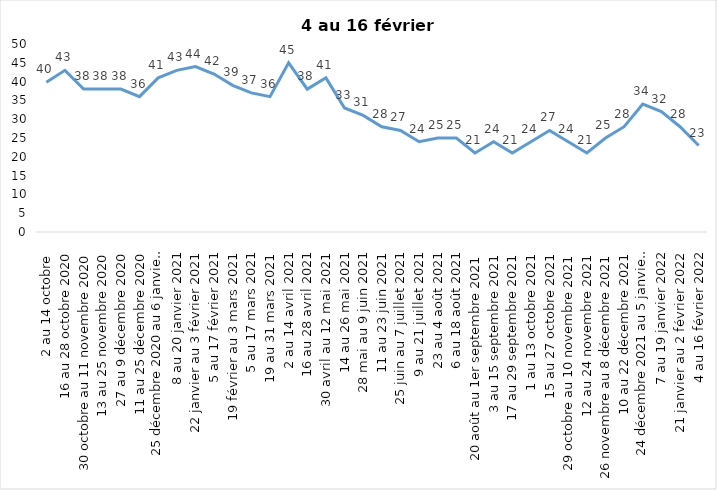
| Category | Toujours aux trois mesures |
|---|---|
| 2 au 14 octobre  | 39.85 |
| 16 au 28 octobre 2020 | 43 |
| 30 octobre au 11 novembre 2020 | 38 |
| 13 au 25 novembre 2020 | 38 |
| 27 au 9 décembre 2020 | 38 |
| 11 au 25 décembre 2020 | 36 |
| 25 décembre 2020 au 6 janvier 2021 | 41 |
| 8 au 20 janvier 2021 | 43 |
| 22 janvier au 3 février 2021 | 44 |
| 5 au 17 février 2021 | 42 |
| 19 février au 3 mars 2021 | 39 |
| 5 au 17 mars 2021 | 37 |
| 19 au 31 mars 2021 | 36 |
| 2 au 14 avril 2021 | 45 |
| 16 au 28 avril 2021 | 38 |
| 30 avril au 12 mai 2021 | 41 |
| 14 au 26 mai 2021 | 33 |
| 28 mai au 9 juin 2021 | 31 |
| 11 au 23 juin 2021 | 28 |
| 25 juin au 7 juillet 2021 | 27 |
| 9 au 21 juillet 2021 | 24 |
| 23 au 4 août 2021 | 25 |
| 6 au 18 août 2021 | 25 |
| 20 août au 1er septembre 2021 | 21 |
| 3 au 15 septembre 2021 | 24 |
| 17 au 29 septembre 2021 | 21 |
| 1 au 13 octobre 2021 | 24 |
| 15 au 27 octobre 2021 | 27 |
| 29 octobre au 10 novembre 2021 | 24 |
| 12 au 24 novembre 2021 | 21 |
| 26 novembre au 8 décembre 2021 | 25 |
| 10 au 22 décembre 2021 | 28 |
| 24 décembre 2021 au 5 janvier 2022 2022 | 34 |
| 7 au 19 janvier 2022 | 32 |
| 21 janvier au 2 février 2022 | 28 |
| 4 au 16 février 2022 | 23 |